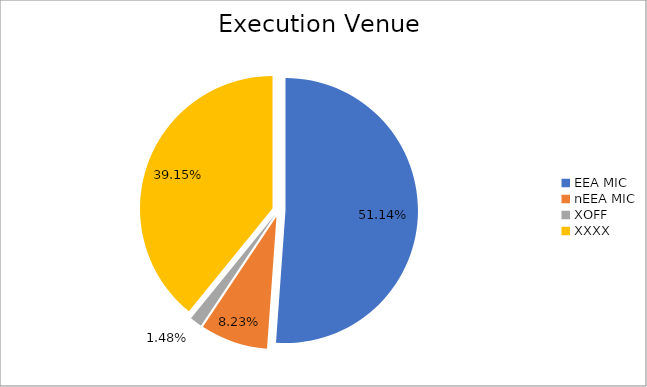
| Category | Series 0 |
|---|---|
| EEA MIC | 6904710.474 |
| nEEA MIC | 1110952.897 |
| XOFF | 199886.42 |
| XXXX | 5285306.071 |